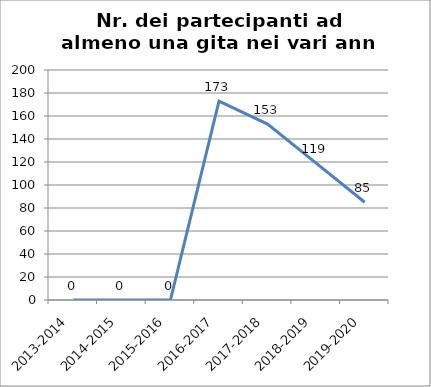
| Category | Nr. Partecipanti ad almeno una Gita |
|---|---|
| 2013-2014 | 0 |
| 2014-2015 | 0 |
| 2015-2016 | 0 |
| 2016-2017 | 173 |
| 2017-2018 | 153 |
| 2018-2019 | 119 |
| 2019-2020 | 85 |